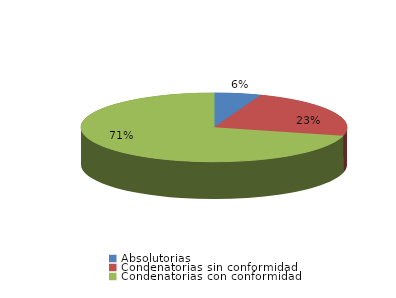
| Category | Series 0 |
|---|---|
| Absolutorias | 11 |
| Condenatorias sin conformidad | 45 |
| Condenatorias con conformidad | 138 |